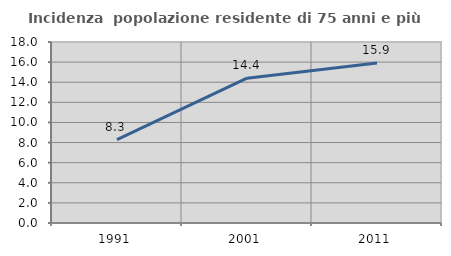
| Category | Incidenza  popolazione residente di 75 anni e più |
|---|---|
| 1991.0 | 8.286 |
| 2001.0 | 14.406 |
| 2011.0 | 15.923 |